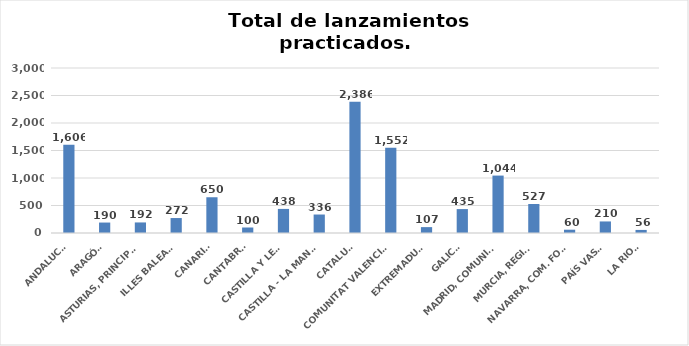
| Category | Series 0 |
|---|---|
| ANDALUCÍA | 1606 |
| ARAGÓN | 190 |
| ASTURIAS, PRINCIPADO | 192 |
| ILLES BALEARS | 272 |
| CANARIAS | 650 |
| CANTABRIA | 100 |
| CASTILLA Y LEÓN | 438 |
| CASTILLA - LA MANCHA | 336 |
| CATALUÑA | 2386 |
| COMUNITAT VALENCIANA | 1552 |
| EXTREMADURA | 107 |
| GALICIA | 435 |
| MADRID, COMUNIDAD | 1044 |
| MURCIA, REGIÓN | 527 |
| NAVARRA, COM. FORAL | 60 |
| PAÍS VASCO | 210 |
| LA RIOJA | 56 |